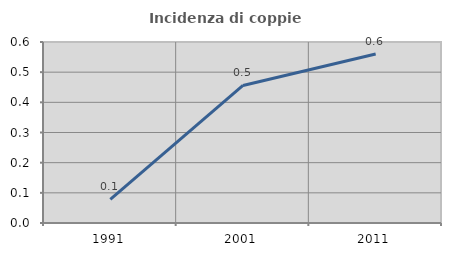
| Category | Incidenza di coppie miste |
|---|---|
| 1991.0 | 0.078 |
| 2001.0 | 0.456 |
| 2011.0 | 0.56 |